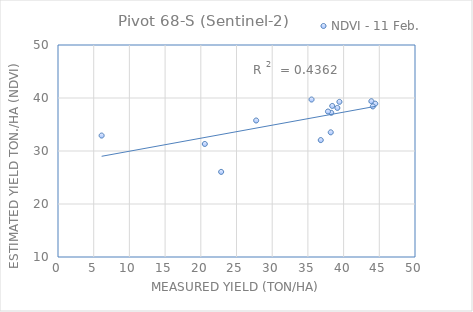
| Category | NDVI - 11 Feb. |
|---|---|
| 43.889999 | 39.388 |
| 35.509998 | 39.712 |
| 38.266998 | 37.207 |
| 27.753 | 35.754 |
| 22.85 | 26.056 |
| 39.126998 | 38.126 |
| 37.810001 | 37.45 |
| 36.799999 | 32.056 |
| 39.416999 | 39.27 |
| 44.432998 | 38.926 |
| 44.092998 | 38.412 |
| 38.2 | 33.522 |
| 20.559999 | 31.324 |
| 6.11 | 32.912 |
| 38.409999 | 38.501 |